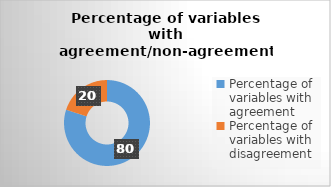
| Category | Series 2 |
|---|---|
| Percentage of variables with agreement | 80 |
| Percentage of variables with disagreement | 20 |